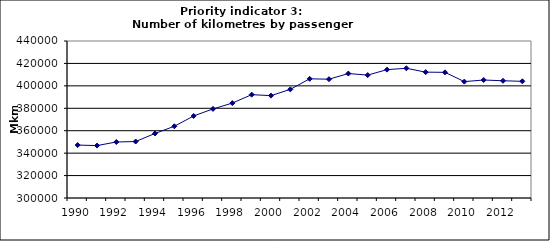
| Category | Number of kilometres by passenger cars, Mkm |
|---|---|
| 1990 | 347191.509 |
| 1991 | 346734.1 |
| 1992 | 349945.498 |
| 1993 | 350342.137 |
| 1994 | 357568.158 |
| 1995 | 363962.77 |
| 1996 | 373162.828 |
| 1997 | 379435.235 |
| 1998 | 384632.771 |
| 1999 | 392144.734 |
| 2000 | 391281.475 |
| 2001 | 396869.58 |
| 2002 | 406275.508 |
| 2003 | 405936.655 |
| 2004 | 410980.858 |
| 2005 | 409591.444 |
| 2006 | 414467.381 |
| 2007 | 415667.21 |
| 2008 | 412238.374 |
| 2009 | 412048.303 |
| 2010 | 403783.086 |
| 2011 | 405217.904 |
| 2012 | 404531.267 |
| 2013 | 404040.944 |